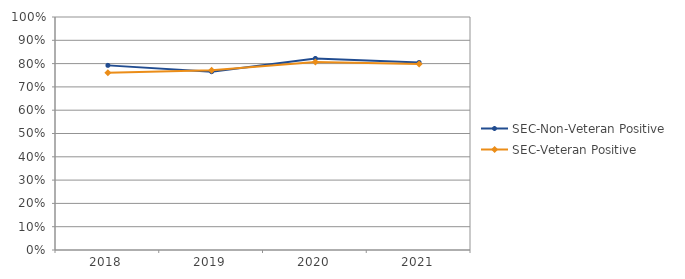
| Category | SEC-Non-Veteran Positive | SEC-Veteran Positive |
|---|---|---|
| 2018 | 0.792 | 0.761 |
| 2019 | 0.765 | 0.771 |
| 2020 | 0.822 | 0.806 |
| 2021 | 0.805 | 0.798 |